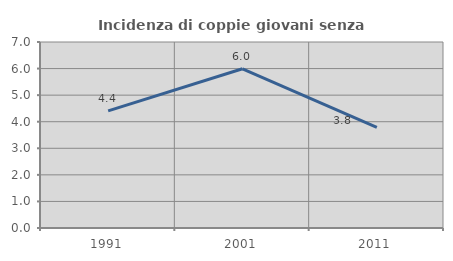
| Category | Incidenza di coppie giovani senza figli |
|---|---|
| 1991.0 | 4.408 |
| 2001.0 | 5.992 |
| 2011.0 | 3.788 |